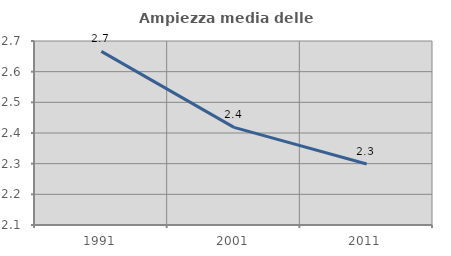
| Category | Ampiezza media delle famiglie |
|---|---|
| 1991.0 | 2.666 |
| 2001.0 | 2.418 |
| 2011.0 | 2.299 |